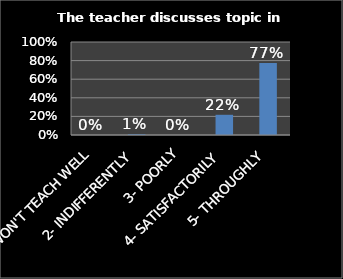
| Category | Series 0 |
|---|---|
| 1- WON'T TEACH WELL | 0 |
| 2- INDIFFERENTLY | 0.009 |
| 3- POORLY | 0 |
| 4- SATISFACTORILY | 0.217 |
| 5- THROUGHLY | 0.774 |